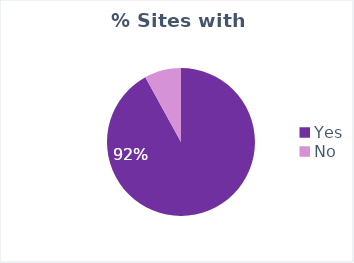
| Category | Central Rakhine |
|---|---|
| Yes | 0.92 |
| No | 0.08 |